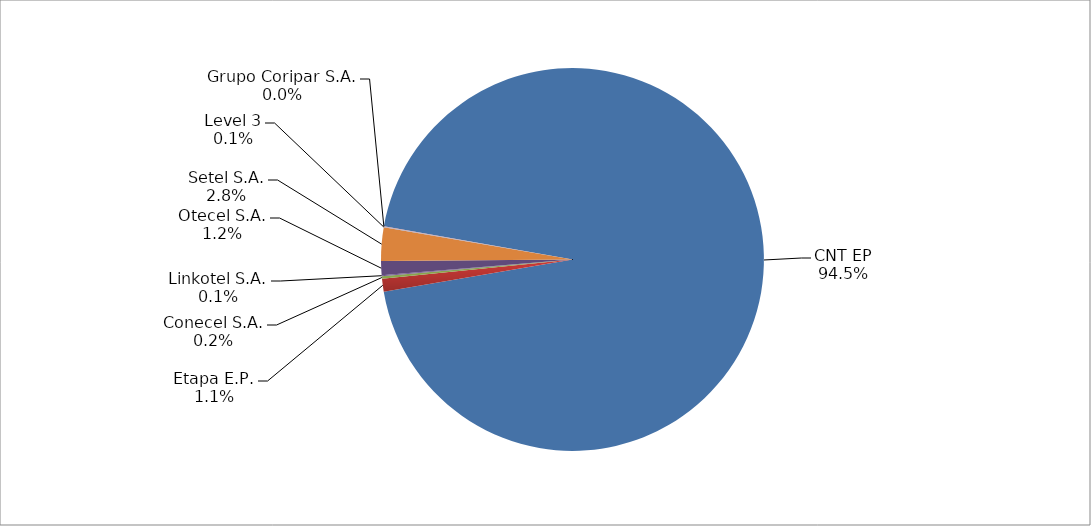
| Category | Series 0 |
|---|---|
| CNT EP | 2176 |
| Etapa E.P. | 25 |
| Conecel S.A. | 5 |
| Linkotel S.A. | 2 |
| Otecel S.A. | 27 |
| Setel S.A. | 65 |
| Level 3 | 1 |
| Grupo Coripar S.A. | 1 |